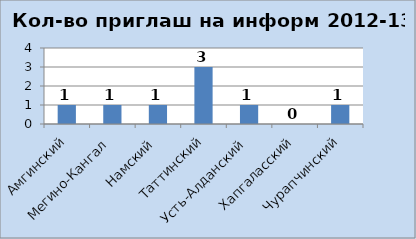
| Category | информатика |
|---|---|
| Амгинский | 1 |
| Мегино-Кангал | 1 |
| Намский | 1 |
| Таттинский | 3 |
| Усть-Алданский | 1 |
| Хапгаласский | 0 |
| Чурапчинский | 1 |